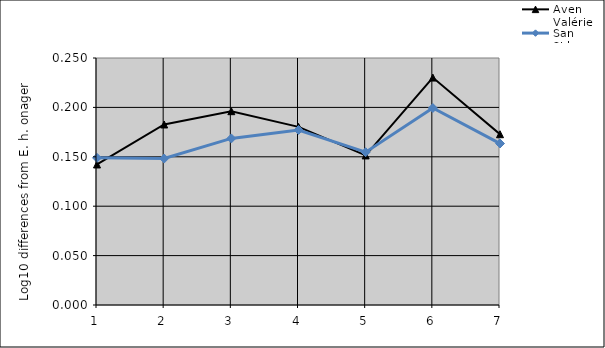
| Category | Aven Valérie | San Sidero |
|---|---|---|
| 1.0 | 0.142 | 0.149 |
| 2.0 | 0.183 | 0.148 |
| 3.0 | 0.196 | 0.169 |
| 4.0 | 0.18 | 0.177 |
| 5.0 | 0.151 | 0.155 |
| 6.0 | 0.23 | 0.199 |
| 7.0 | 0.173 | 0.163 |